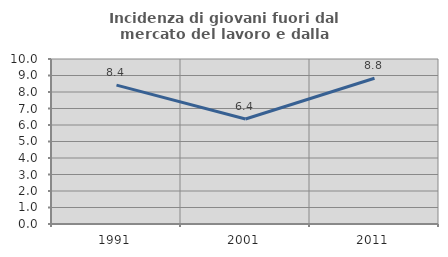
| Category | Incidenza di giovani fuori dal mercato del lavoro e dalla formazione  |
|---|---|
| 1991.0 | 8.415 |
| 2001.0 | 6.364 |
| 2011.0 | 8.834 |